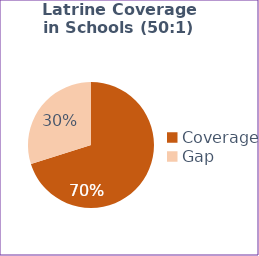
| Category | Series 0 |
|---|---|
| Coverage | 97 |
| Gap | 41.3 |